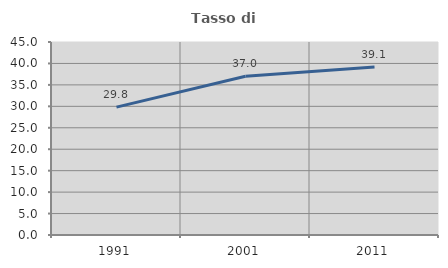
| Category | Tasso di occupazione   |
|---|---|
| 1991.0 | 29.818 |
| 2001.0 | 37.003 |
| 2011.0 | 39.147 |